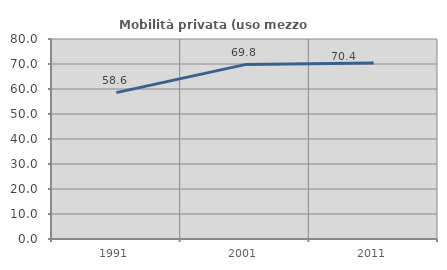
| Category | Mobilità privata (uso mezzo privato) |
|---|---|
| 1991.0 | 58.556 |
| 2001.0 | 69.758 |
| 2011.0 | 70.368 |